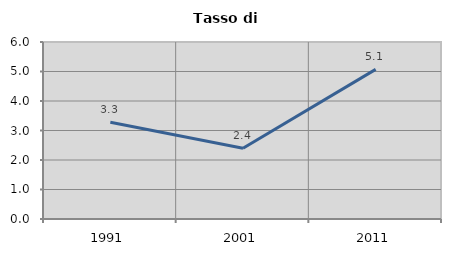
| Category | Tasso di disoccupazione   |
|---|---|
| 1991.0 | 3.279 |
| 2001.0 | 2.4 |
| 2011.0 | 5.072 |